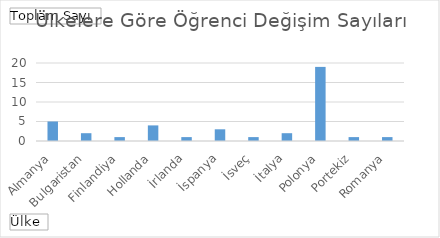
| Category | Toplam |
|---|---|
| Almanya | 5 |
| Bulgaristan | 2 |
| Finlandiya | 1 |
| Hollanda | 4 |
| İrlanda | 1 |
| İspanya | 3 |
| İsveç | 1 |
| İtalya | 2 |
| Polonya | 19 |
| Portekiz | 1 |
| Romanya | 1 |